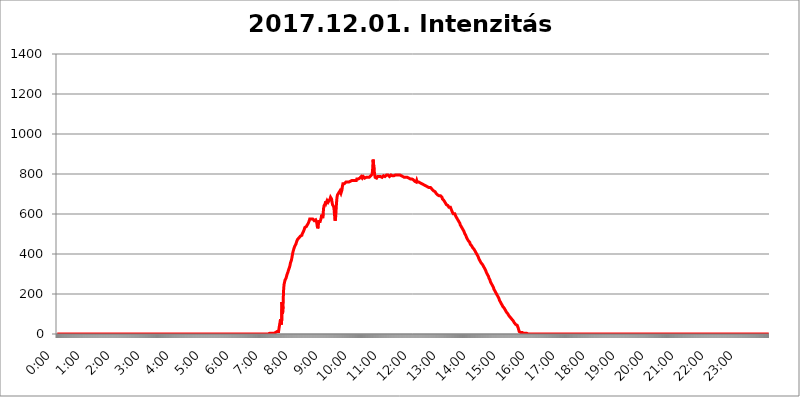
| Category | 2017.12.01. Intenzitás [W/m^2] |
|---|---|
| 0.0 | 0 |
| 0.0006944444444444445 | 0 |
| 0.001388888888888889 | 0 |
| 0.0020833333333333333 | 0 |
| 0.002777777777777778 | 0 |
| 0.003472222222222222 | 0 |
| 0.004166666666666667 | 0 |
| 0.004861111111111111 | 0 |
| 0.005555555555555556 | 0 |
| 0.0062499999999999995 | 0 |
| 0.006944444444444444 | 0 |
| 0.007638888888888889 | 0 |
| 0.008333333333333333 | 0 |
| 0.009027777777777779 | 0 |
| 0.009722222222222222 | 0 |
| 0.010416666666666666 | 0 |
| 0.011111111111111112 | 0 |
| 0.011805555555555555 | 0 |
| 0.012499999999999999 | 0 |
| 0.013194444444444444 | 0 |
| 0.013888888888888888 | 0 |
| 0.014583333333333332 | 0 |
| 0.015277777777777777 | 0 |
| 0.015972222222222224 | 0 |
| 0.016666666666666666 | 0 |
| 0.017361111111111112 | 0 |
| 0.018055555555555557 | 0 |
| 0.01875 | 0 |
| 0.019444444444444445 | 0 |
| 0.02013888888888889 | 0 |
| 0.020833333333333332 | 0 |
| 0.02152777777777778 | 0 |
| 0.022222222222222223 | 0 |
| 0.02291666666666667 | 0 |
| 0.02361111111111111 | 0 |
| 0.024305555555555556 | 0 |
| 0.024999999999999998 | 0 |
| 0.025694444444444447 | 0 |
| 0.02638888888888889 | 0 |
| 0.027083333333333334 | 0 |
| 0.027777777777777776 | 0 |
| 0.02847222222222222 | 0 |
| 0.029166666666666664 | 0 |
| 0.029861111111111113 | 0 |
| 0.030555555555555555 | 0 |
| 0.03125 | 0 |
| 0.03194444444444445 | 0 |
| 0.03263888888888889 | 0 |
| 0.03333333333333333 | 0 |
| 0.034027777777777775 | 0 |
| 0.034722222222222224 | 0 |
| 0.035416666666666666 | 0 |
| 0.036111111111111115 | 0 |
| 0.03680555555555556 | 0 |
| 0.0375 | 0 |
| 0.03819444444444444 | 0 |
| 0.03888888888888889 | 0 |
| 0.03958333333333333 | 0 |
| 0.04027777777777778 | 0 |
| 0.04097222222222222 | 0 |
| 0.041666666666666664 | 0 |
| 0.042361111111111106 | 0 |
| 0.04305555555555556 | 0 |
| 0.043750000000000004 | 0 |
| 0.044444444444444446 | 0 |
| 0.04513888888888889 | 0 |
| 0.04583333333333334 | 0 |
| 0.04652777777777778 | 0 |
| 0.04722222222222222 | 0 |
| 0.04791666666666666 | 0 |
| 0.04861111111111111 | 0 |
| 0.049305555555555554 | 0 |
| 0.049999999999999996 | 0 |
| 0.05069444444444445 | 0 |
| 0.051388888888888894 | 0 |
| 0.052083333333333336 | 0 |
| 0.05277777777777778 | 0 |
| 0.05347222222222222 | 0 |
| 0.05416666666666667 | 0 |
| 0.05486111111111111 | 0 |
| 0.05555555555555555 | 0 |
| 0.05625 | 0 |
| 0.05694444444444444 | 0 |
| 0.057638888888888885 | 0 |
| 0.05833333333333333 | 0 |
| 0.05902777777777778 | 0 |
| 0.059722222222222225 | 0 |
| 0.06041666666666667 | 0 |
| 0.061111111111111116 | 0 |
| 0.06180555555555556 | 0 |
| 0.0625 | 0 |
| 0.06319444444444444 | 0 |
| 0.06388888888888888 | 0 |
| 0.06458333333333334 | 0 |
| 0.06527777777777778 | 0 |
| 0.06597222222222222 | 0 |
| 0.06666666666666667 | 0 |
| 0.06736111111111111 | 0 |
| 0.06805555555555555 | 0 |
| 0.06874999999999999 | 0 |
| 0.06944444444444443 | 0 |
| 0.07013888888888889 | 0 |
| 0.07083333333333333 | 0 |
| 0.07152777777777779 | 0 |
| 0.07222222222222223 | 0 |
| 0.07291666666666667 | 0 |
| 0.07361111111111111 | 0 |
| 0.07430555555555556 | 0 |
| 0.075 | 0 |
| 0.07569444444444444 | 0 |
| 0.0763888888888889 | 0 |
| 0.07708333333333334 | 0 |
| 0.07777777777777778 | 0 |
| 0.07847222222222222 | 0 |
| 0.07916666666666666 | 0 |
| 0.0798611111111111 | 0 |
| 0.08055555555555556 | 0 |
| 0.08125 | 0 |
| 0.08194444444444444 | 0 |
| 0.08263888888888889 | 0 |
| 0.08333333333333333 | 0 |
| 0.08402777777777777 | 0 |
| 0.08472222222222221 | 0 |
| 0.08541666666666665 | 0 |
| 0.08611111111111112 | 0 |
| 0.08680555555555557 | 0 |
| 0.08750000000000001 | 0 |
| 0.08819444444444445 | 0 |
| 0.08888888888888889 | 0 |
| 0.08958333333333333 | 0 |
| 0.09027777777777778 | 0 |
| 0.09097222222222222 | 0 |
| 0.09166666666666667 | 0 |
| 0.09236111111111112 | 0 |
| 0.09305555555555556 | 0 |
| 0.09375 | 0 |
| 0.09444444444444444 | 0 |
| 0.09513888888888888 | 0 |
| 0.09583333333333333 | 0 |
| 0.09652777777777777 | 0 |
| 0.09722222222222222 | 0 |
| 0.09791666666666667 | 0 |
| 0.09861111111111111 | 0 |
| 0.09930555555555555 | 0 |
| 0.09999999999999999 | 0 |
| 0.10069444444444443 | 0 |
| 0.1013888888888889 | 0 |
| 0.10208333333333335 | 0 |
| 0.10277777777777779 | 0 |
| 0.10347222222222223 | 0 |
| 0.10416666666666667 | 0 |
| 0.10486111111111111 | 0 |
| 0.10555555555555556 | 0 |
| 0.10625 | 0 |
| 0.10694444444444444 | 0 |
| 0.1076388888888889 | 0 |
| 0.10833333333333334 | 0 |
| 0.10902777777777778 | 0 |
| 0.10972222222222222 | 0 |
| 0.1111111111111111 | 0 |
| 0.11180555555555556 | 0 |
| 0.11180555555555556 | 0 |
| 0.1125 | 0 |
| 0.11319444444444444 | 0 |
| 0.11388888888888889 | 0 |
| 0.11458333333333333 | 0 |
| 0.11527777777777777 | 0 |
| 0.11597222222222221 | 0 |
| 0.11666666666666665 | 0 |
| 0.1173611111111111 | 0 |
| 0.11805555555555557 | 0 |
| 0.11944444444444445 | 0 |
| 0.12013888888888889 | 0 |
| 0.12083333333333333 | 0 |
| 0.12152777777777778 | 0 |
| 0.12222222222222223 | 0 |
| 0.12291666666666667 | 0 |
| 0.12291666666666667 | 0 |
| 0.12361111111111112 | 0 |
| 0.12430555555555556 | 0 |
| 0.125 | 0 |
| 0.12569444444444444 | 0 |
| 0.12638888888888888 | 0 |
| 0.12708333333333333 | 0 |
| 0.16875 | 0 |
| 0.12847222222222224 | 0 |
| 0.12916666666666668 | 0 |
| 0.12986111111111112 | 0 |
| 0.13055555555555556 | 0 |
| 0.13125 | 0 |
| 0.13194444444444445 | 0 |
| 0.1326388888888889 | 0 |
| 0.13333333333333333 | 0 |
| 0.13402777777777777 | 0 |
| 0.13402777777777777 | 0 |
| 0.13472222222222222 | 0 |
| 0.13541666666666666 | 0 |
| 0.1361111111111111 | 0 |
| 0.13749999999999998 | 0 |
| 0.13819444444444443 | 0 |
| 0.1388888888888889 | 0 |
| 0.13958333333333334 | 0 |
| 0.14027777777777778 | 0 |
| 0.14097222222222222 | 0 |
| 0.14166666666666666 | 0 |
| 0.1423611111111111 | 0 |
| 0.14305555555555557 | 0 |
| 0.14375000000000002 | 0 |
| 0.14444444444444446 | 0 |
| 0.1451388888888889 | 0 |
| 0.1451388888888889 | 0 |
| 0.14652777777777778 | 0 |
| 0.14722222222222223 | 0 |
| 0.14791666666666667 | 0 |
| 0.1486111111111111 | 0 |
| 0.14930555555555555 | 0 |
| 0.15 | 0 |
| 0.15069444444444444 | 0 |
| 0.15138888888888888 | 0 |
| 0.15208333333333332 | 0 |
| 0.15277777777777776 | 0 |
| 0.15347222222222223 | 0 |
| 0.15416666666666667 | 0 |
| 0.15486111111111112 | 0 |
| 0.15555555555555556 | 0 |
| 0.15625 | 0 |
| 0.15694444444444444 | 0 |
| 0.15763888888888888 | 0 |
| 0.15833333333333333 | 0 |
| 0.15902777777777777 | 0 |
| 0.15972222222222224 | 0 |
| 0.16041666666666668 | 0 |
| 0.16111111111111112 | 0 |
| 0.16180555555555556 | 0 |
| 0.1625 | 0 |
| 0.16319444444444445 | 0 |
| 0.1638888888888889 | 0 |
| 0.16458333333333333 | 0 |
| 0.16527777777777777 | 0 |
| 0.16597222222222222 | 0 |
| 0.16666666666666666 | 0 |
| 0.1673611111111111 | 0 |
| 0.16805555555555554 | 0 |
| 0.16874999999999998 | 0 |
| 0.16944444444444443 | 0 |
| 0.17013888888888887 | 0 |
| 0.1708333333333333 | 0 |
| 0.17152777777777775 | 0 |
| 0.17222222222222225 | 0 |
| 0.1729166666666667 | 0 |
| 0.17361111111111113 | 0 |
| 0.17430555555555557 | 0 |
| 0.17500000000000002 | 0 |
| 0.17569444444444446 | 0 |
| 0.1763888888888889 | 0 |
| 0.17708333333333334 | 0 |
| 0.17777777777777778 | 0 |
| 0.17847222222222223 | 0 |
| 0.17916666666666667 | 0 |
| 0.1798611111111111 | 0 |
| 0.18055555555555555 | 0 |
| 0.18125 | 0 |
| 0.18194444444444444 | 0 |
| 0.1826388888888889 | 0 |
| 0.18333333333333335 | 0 |
| 0.1840277777777778 | 0 |
| 0.18472222222222223 | 0 |
| 0.18541666666666667 | 0 |
| 0.18611111111111112 | 0 |
| 0.18680555555555556 | 0 |
| 0.1875 | 0 |
| 0.18819444444444444 | 0 |
| 0.18888888888888888 | 0 |
| 0.18958333333333333 | 0 |
| 0.19027777777777777 | 0 |
| 0.1909722222222222 | 0 |
| 0.19166666666666665 | 0 |
| 0.19236111111111112 | 0 |
| 0.19305555555555554 | 0 |
| 0.19375 | 0 |
| 0.19444444444444445 | 0 |
| 0.1951388888888889 | 0 |
| 0.19583333333333333 | 0 |
| 0.19652777777777777 | 0 |
| 0.19722222222222222 | 0 |
| 0.19791666666666666 | 0 |
| 0.1986111111111111 | 0 |
| 0.19930555555555554 | 0 |
| 0.19999999999999998 | 0 |
| 0.20069444444444443 | 0 |
| 0.20138888888888887 | 0 |
| 0.2020833333333333 | 0 |
| 0.2027777777777778 | 0 |
| 0.2034722222222222 | 0 |
| 0.2041666666666667 | 0 |
| 0.20486111111111113 | 0 |
| 0.20555555555555557 | 0 |
| 0.20625000000000002 | 0 |
| 0.20694444444444446 | 0 |
| 0.2076388888888889 | 0 |
| 0.20833333333333334 | 0 |
| 0.20902777777777778 | 0 |
| 0.20972222222222223 | 0 |
| 0.21041666666666667 | 0 |
| 0.2111111111111111 | 0 |
| 0.21180555555555555 | 0 |
| 0.2125 | 0 |
| 0.21319444444444444 | 0 |
| 0.2138888888888889 | 0 |
| 0.21458333333333335 | 0 |
| 0.2152777777777778 | 0 |
| 0.21597222222222223 | 0 |
| 0.21666666666666667 | 0 |
| 0.21736111111111112 | 0 |
| 0.21805555555555556 | 0 |
| 0.21875 | 0 |
| 0.21944444444444444 | 0 |
| 0.22013888888888888 | 0 |
| 0.22083333333333333 | 0 |
| 0.22152777777777777 | 0 |
| 0.2222222222222222 | 0 |
| 0.22291666666666665 | 0 |
| 0.2236111111111111 | 0 |
| 0.22430555555555556 | 0 |
| 0.225 | 0 |
| 0.22569444444444445 | 0 |
| 0.2263888888888889 | 0 |
| 0.22708333333333333 | 0 |
| 0.22777777777777777 | 0 |
| 0.22847222222222222 | 0 |
| 0.22916666666666666 | 0 |
| 0.2298611111111111 | 0 |
| 0.23055555555555554 | 0 |
| 0.23124999999999998 | 0 |
| 0.23194444444444443 | 0 |
| 0.23263888888888887 | 0 |
| 0.2333333333333333 | 0 |
| 0.2340277777777778 | 0 |
| 0.2347222222222222 | 0 |
| 0.2354166666666667 | 0 |
| 0.23611111111111113 | 0 |
| 0.23680555555555557 | 0 |
| 0.23750000000000002 | 0 |
| 0.23819444444444446 | 0 |
| 0.2388888888888889 | 0 |
| 0.23958333333333334 | 0 |
| 0.24027777777777778 | 0 |
| 0.24097222222222223 | 0 |
| 0.24166666666666667 | 0 |
| 0.2423611111111111 | 0 |
| 0.24305555555555555 | 0 |
| 0.24375 | 0 |
| 0.24444444444444446 | 0 |
| 0.24513888888888888 | 0 |
| 0.24583333333333335 | 0 |
| 0.2465277777777778 | 0 |
| 0.24722222222222223 | 0 |
| 0.24791666666666667 | 0 |
| 0.24861111111111112 | 0 |
| 0.24930555555555556 | 0 |
| 0.25 | 0 |
| 0.25069444444444444 | 0 |
| 0.2513888888888889 | 0 |
| 0.2520833333333333 | 0 |
| 0.25277777777777777 | 0 |
| 0.2534722222222222 | 0 |
| 0.25416666666666665 | 0 |
| 0.2548611111111111 | 0 |
| 0.2555555555555556 | 0 |
| 0.25625000000000003 | 0 |
| 0.2569444444444445 | 0 |
| 0.2576388888888889 | 0 |
| 0.25833333333333336 | 0 |
| 0.2590277777777778 | 0 |
| 0.25972222222222224 | 0 |
| 0.2604166666666667 | 0 |
| 0.2611111111111111 | 0 |
| 0.26180555555555557 | 0 |
| 0.2625 | 0 |
| 0.26319444444444445 | 0 |
| 0.2638888888888889 | 0 |
| 0.26458333333333334 | 0 |
| 0.2652777777777778 | 0 |
| 0.2659722222222222 | 0 |
| 0.26666666666666666 | 0 |
| 0.2673611111111111 | 0 |
| 0.26805555555555555 | 0 |
| 0.26875 | 0 |
| 0.26944444444444443 | 0 |
| 0.2701388888888889 | 0 |
| 0.2708333333333333 | 0 |
| 0.27152777777777776 | 0 |
| 0.2722222222222222 | 0 |
| 0.27291666666666664 | 0 |
| 0.2736111111111111 | 0 |
| 0.2743055555555555 | 0 |
| 0.27499999999999997 | 0 |
| 0.27569444444444446 | 0 |
| 0.27638888888888885 | 0 |
| 0.27708333333333335 | 0 |
| 0.2777777777777778 | 0 |
| 0.27847222222222223 | 0 |
| 0.2791666666666667 | 0 |
| 0.2798611111111111 | 0 |
| 0.28055555555555556 | 0 |
| 0.28125 | 0 |
| 0.28194444444444444 | 0 |
| 0.2826388888888889 | 0 |
| 0.2833333333333333 | 0 |
| 0.28402777777777777 | 0 |
| 0.2847222222222222 | 0 |
| 0.28541666666666665 | 0 |
| 0.28611111111111115 | 0 |
| 0.28680555555555554 | 0 |
| 0.28750000000000003 | 0 |
| 0.2881944444444445 | 0 |
| 0.2888888888888889 | 0 |
| 0.28958333333333336 | 0 |
| 0.2902777777777778 | 0 |
| 0.29097222222222224 | 0 |
| 0.2916666666666667 | 0 |
| 0.2923611111111111 | 0 |
| 0.29305555555555557 | 0 |
| 0.29375 | 0 |
| 0.29444444444444445 | 0 |
| 0.2951388888888889 | 0 |
| 0.29583333333333334 | 0 |
| 0.2965277777777778 | 3.525 |
| 0.2972222222222222 | 3.525 |
| 0.29791666666666666 | 3.525 |
| 0.2986111111111111 | 3.525 |
| 0.29930555555555555 | 3.525 |
| 0.3 | 3.525 |
| 0.30069444444444443 | 3.525 |
| 0.3013888888888889 | 3.525 |
| 0.3020833333333333 | 3.525 |
| 0.30277777777777776 | 3.525 |
| 0.3034722222222222 | 3.525 |
| 0.30416666666666664 | 3.525 |
| 0.3048611111111111 | 7.887 |
| 0.3055555555555555 | 7.887 |
| 0.30624999999999997 | 7.887 |
| 0.3069444444444444 | 7.887 |
| 0.3076388888888889 | 12.257 |
| 0.30833333333333335 | 12.257 |
| 0.3090277777777778 | 12.257 |
| 0.30972222222222223 | 16.636 |
| 0.3104166666666667 | 12.257 |
| 0.3111111111111111 | 29.823 |
| 0.31180555555555556 | 29.823 |
| 0.3125 | 29.823 |
| 0.31319444444444444 | 74.246 |
| 0.3138888888888889 | 74.246 |
| 0.3145833333333333 | 47.511 |
| 0.31527777777777777 | 160.056 |
| 0.3159722222222222 | 101.184 |
| 0.31666666666666665 | 137.347 |
| 0.31736111111111115 | 214.746 |
| 0.31805555555555554 | 246.689 |
| 0.31875000000000003 | 251.251 |
| 0.3194444444444445 | 269.49 |
| 0.3201388888888889 | 269.49 |
| 0.32083333333333336 | 278.603 |
| 0.3215277777777778 | 283.156 |
| 0.32222222222222224 | 296.808 |
| 0.3229166666666667 | 301.354 |
| 0.3236111111111111 | 310.44 |
| 0.32430555555555557 | 319.517 |
| 0.325 | 324.052 |
| 0.32569444444444445 | 333.113 |
| 0.3263888888888889 | 342.162 |
| 0.32708333333333334 | 355.712 |
| 0.3277777777777778 | 360.221 |
| 0.3284722222222222 | 369.23 |
| 0.32916666666666666 | 382.715 |
| 0.3298611111111111 | 396.164 |
| 0.33055555555555555 | 409.574 |
| 0.33125 | 418.492 |
| 0.33194444444444443 | 427.39 |
| 0.3326388888888889 | 431.833 |
| 0.3333333333333333 | 440.702 |
| 0.3340277777777778 | 445.129 |
| 0.3347222222222222 | 449.551 |
| 0.3354166666666667 | 458.38 |
| 0.3361111111111111 | 462.786 |
| 0.3368055555555556 | 471.582 |
| 0.33749999999999997 | 471.582 |
| 0.33819444444444446 | 475.972 |
| 0.33888888888888885 | 480.356 |
| 0.33958333333333335 | 480.356 |
| 0.34027777777777773 | 480.356 |
| 0.34097222222222223 | 489.108 |
| 0.3416666666666666 | 489.108 |
| 0.3423611111111111 | 489.108 |
| 0.3430555555555555 | 493.475 |
| 0.34375 | 502.192 |
| 0.3444444444444445 | 506.542 |
| 0.3451388888888889 | 510.885 |
| 0.3458333333333334 | 515.223 |
| 0.34652777777777777 | 523.88 |
| 0.34722222222222227 | 532.513 |
| 0.34791666666666665 | 532.513 |
| 0.34861111111111115 | 536.82 |
| 0.34930555555555554 | 536.82 |
| 0.35000000000000003 | 541.121 |
| 0.3506944444444444 | 545.416 |
| 0.3513888888888889 | 549.704 |
| 0.3520833333333333 | 553.986 |
| 0.3527777777777778 | 558.261 |
| 0.3534722222222222 | 566.793 |
| 0.3541666666666667 | 575.299 |
| 0.3548611111111111 | 571.049 |
| 0.35555555555555557 | 575.299 |
| 0.35625 | 575.299 |
| 0.35694444444444445 | 571.049 |
| 0.3576388888888889 | 571.049 |
| 0.35833333333333334 | 575.299 |
| 0.3590277777777778 | 571.049 |
| 0.3597222222222222 | 575.299 |
| 0.36041666666666666 | 566.793 |
| 0.3611111111111111 | 562.53 |
| 0.36180555555555555 | 566.793 |
| 0.3625 | 571.049 |
| 0.36319444444444443 | 571.049 |
| 0.3638888888888889 | 558.261 |
| 0.3645833333333333 | 541.121 |
| 0.3652777777777778 | 528.2 |
| 0.3659722222222222 | 536.82 |
| 0.3666666666666667 | 562.53 |
| 0.3673611111111111 | 566.793 |
| 0.3680555555555556 | 566.793 |
| 0.36874999999999997 | 562.53 |
| 0.36944444444444446 | 558.261 |
| 0.37013888888888885 | 579.542 |
| 0.37083333333333335 | 596.45 |
| 0.37152777777777773 | 592.233 |
| 0.37222222222222223 | 579.542 |
| 0.3729166666666666 | 600.661 |
| 0.3736111111111111 | 629.948 |
| 0.3743055555555555 | 642.4 |
| 0.375 | 642.4 |
| 0.3756944444444445 | 650.667 |
| 0.3763888888888889 | 663.019 |
| 0.3770833333333334 | 654.791 |
| 0.37777777777777777 | 658.909 |
| 0.37847222222222227 | 667.123 |
| 0.37916666666666665 | 667.123 |
| 0.37986111111111115 | 658.909 |
| 0.38055555555555554 | 654.791 |
| 0.38125000000000003 | 667.123 |
| 0.3819444444444444 | 671.22 |
| 0.3826388888888889 | 675.311 |
| 0.3833333333333333 | 683.473 |
| 0.3840277777777778 | 683.473 |
| 0.3847222222222222 | 675.311 |
| 0.3854166666666667 | 658.909 |
| 0.3861111111111111 | 646.537 |
| 0.38680555555555557 | 646.537 |
| 0.3875 | 638.256 |
| 0.38819444444444445 | 625.784 |
| 0.3888888888888889 | 596.45 |
| 0.38958333333333334 | 566.793 |
| 0.3902777777777778 | 575.299 |
| 0.3909722222222222 | 613.252 |
| 0.39166666666666666 | 654.791 |
| 0.3923611111111111 | 683.473 |
| 0.39305555555555555 | 695.666 |
| 0.39375 | 699.717 |
| 0.39444444444444443 | 703.762 |
| 0.3951388888888889 | 707.8 |
| 0.3958333333333333 | 707.8 |
| 0.3965277777777778 | 715.858 |
| 0.3972222222222222 | 715.858 |
| 0.3979166666666667 | 703.762 |
| 0.3986111111111111 | 699.717 |
| 0.3993055555555556 | 719.877 |
| 0.39999999999999997 | 739.877 |
| 0.40069444444444446 | 751.803 |
| 0.40138888888888885 | 751.803 |
| 0.40208333333333335 | 751.803 |
| 0.40277777777777773 | 751.803 |
| 0.40347222222222223 | 751.803 |
| 0.4041666666666666 | 755.766 |
| 0.4048611111111111 | 759.723 |
| 0.4055555555555555 | 759.723 |
| 0.40625 | 759.723 |
| 0.4069444444444445 | 759.723 |
| 0.4076388888888889 | 759.723 |
| 0.4083333333333334 | 763.674 |
| 0.40902777777777777 | 759.723 |
| 0.40972222222222227 | 759.723 |
| 0.41041666666666665 | 763.674 |
| 0.41111111111111115 | 763.674 |
| 0.41180555555555554 | 767.62 |
| 0.41250000000000003 | 767.62 |
| 0.4131944444444444 | 767.62 |
| 0.4138888888888889 | 767.62 |
| 0.4145833333333333 | 771.559 |
| 0.4152777777777778 | 767.62 |
| 0.4159722222222222 | 771.559 |
| 0.4166666666666667 | 767.62 |
| 0.4173611111111111 | 767.62 |
| 0.41805555555555557 | 763.674 |
| 0.41875 | 767.62 |
| 0.41944444444444445 | 767.62 |
| 0.4201388888888889 | 775.492 |
| 0.42083333333333334 | 775.492 |
| 0.4215277777777778 | 775.492 |
| 0.4222222222222222 | 775.492 |
| 0.42291666666666666 | 775.492 |
| 0.4236111111111111 | 779.42 |
| 0.42430555555555555 | 779.42 |
| 0.425 | 779.42 |
| 0.42569444444444443 | 779.42 |
| 0.4263888888888889 | 787.258 |
| 0.4270833333333333 | 783.342 |
| 0.4277777777777778 | 779.42 |
| 0.4284722222222222 | 783.342 |
| 0.4291666666666667 | 787.258 |
| 0.4298611111111111 | 783.342 |
| 0.4305555555555556 | 783.342 |
| 0.43124999999999997 | 779.42 |
| 0.43194444444444446 | 779.42 |
| 0.43263888888888885 | 779.42 |
| 0.43333333333333335 | 783.342 |
| 0.43402777777777773 | 787.258 |
| 0.43472222222222223 | 783.342 |
| 0.4354166666666666 | 783.342 |
| 0.4361111111111111 | 783.342 |
| 0.4368055555555555 | 783.342 |
| 0.4375 | 783.342 |
| 0.4381944444444445 | 787.258 |
| 0.4388888888888889 | 787.258 |
| 0.4395833333333334 | 791.169 |
| 0.44027777777777777 | 787.258 |
| 0.44097222222222227 | 791.169 |
| 0.44166666666666665 | 798.974 |
| 0.44236111111111115 | 826.123 |
| 0.44305555555555554 | 872.114 |
| 0.44375000000000003 | 872.114 |
| 0.4444444444444444 | 818.392 |
| 0.4451388888888889 | 798.974 |
| 0.4458333333333333 | 783.342 |
| 0.4465277777777778 | 783.342 |
| 0.4472222222222222 | 783.342 |
| 0.4479166666666667 | 779.42 |
| 0.4486111111111111 | 783.342 |
| 0.44930555555555557 | 787.258 |
| 0.45 | 783.342 |
| 0.45069444444444445 | 787.258 |
| 0.4513888888888889 | 787.258 |
| 0.45208333333333334 | 791.169 |
| 0.4527777777777778 | 787.258 |
| 0.4534722222222222 | 787.258 |
| 0.45416666666666666 | 787.258 |
| 0.4548611111111111 | 787.258 |
| 0.45555555555555555 | 783.342 |
| 0.45625 | 783.342 |
| 0.45694444444444443 | 787.258 |
| 0.4576388888888889 | 791.169 |
| 0.4583333333333333 | 791.169 |
| 0.4590277777777778 | 787.258 |
| 0.4597222222222222 | 787.258 |
| 0.4604166666666667 | 787.258 |
| 0.4611111111111111 | 791.169 |
| 0.4618055555555556 | 795.074 |
| 0.46249999999999997 | 791.169 |
| 0.46319444444444446 | 791.169 |
| 0.46388888888888885 | 795.074 |
| 0.46458333333333335 | 795.074 |
| 0.46527777777777773 | 791.169 |
| 0.46597222222222223 | 787.258 |
| 0.4666666666666666 | 791.169 |
| 0.4673611111111111 | 791.169 |
| 0.4680555555555555 | 795.074 |
| 0.46875 | 795.074 |
| 0.4694444444444445 | 798.974 |
| 0.4701388888888889 | 791.169 |
| 0.4708333333333334 | 791.169 |
| 0.47152777777777777 | 791.169 |
| 0.47222222222222227 | 791.169 |
| 0.47291666666666665 | 791.169 |
| 0.47361111111111115 | 795.074 |
| 0.47430555555555554 | 795.074 |
| 0.47500000000000003 | 795.074 |
| 0.4756944444444444 | 795.074 |
| 0.4763888888888889 | 795.074 |
| 0.4770833333333333 | 795.074 |
| 0.4777777777777778 | 791.169 |
| 0.4784722222222222 | 795.074 |
| 0.4791666666666667 | 791.169 |
| 0.4798611111111111 | 795.074 |
| 0.48055555555555557 | 795.074 |
| 0.48125 | 795.074 |
| 0.48194444444444445 | 791.169 |
| 0.4826388888888889 | 791.169 |
| 0.48333333333333334 | 791.169 |
| 0.4840277777777778 | 791.169 |
| 0.4847222222222222 | 787.258 |
| 0.48541666666666666 | 787.258 |
| 0.4861111111111111 | 787.258 |
| 0.48680555555555555 | 783.342 |
| 0.4875 | 779.42 |
| 0.48819444444444443 | 787.258 |
| 0.4888888888888889 | 783.342 |
| 0.4895833333333333 | 787.258 |
| 0.4902777777777778 | 787.258 |
| 0.4909722222222222 | 783.342 |
| 0.4916666666666667 | 783.342 |
| 0.4923611111111111 | 779.42 |
| 0.4930555555555556 | 779.42 |
| 0.49374999999999997 | 779.42 |
| 0.49444444444444446 | 779.42 |
| 0.49513888888888885 | 775.492 |
| 0.49583333333333335 | 775.492 |
| 0.49652777777777773 | 771.559 |
| 0.49722222222222223 | 775.492 |
| 0.4979166666666666 | 775.492 |
| 0.4986111111111111 | 771.559 |
| 0.4993055555555555 | 771.559 |
| 0.5 | 767.62 |
| 0.5006944444444444 | 767.62 |
| 0.5013888888888889 | 763.674 |
| 0.5020833333333333 | 767.62 |
| 0.5027777777777778 | 767.62 |
| 0.5034722222222222 | 759.723 |
| 0.5041666666666667 | 767.62 |
| 0.5048611111111111 | 759.723 |
| 0.5055555555555555 | 759.723 |
| 0.50625 | 763.674 |
| 0.5069444444444444 | 759.723 |
| 0.5076388888888889 | 763.674 |
| 0.5083333333333333 | 759.723 |
| 0.5090277777777777 | 755.766 |
| 0.5097222222222222 | 751.803 |
| 0.5104166666666666 | 751.803 |
| 0.5111111111111112 | 751.803 |
| 0.5118055555555555 | 751.803 |
| 0.5125000000000001 | 751.803 |
| 0.5131944444444444 | 747.834 |
| 0.513888888888889 | 747.834 |
| 0.5145833333333333 | 743.859 |
| 0.5152777777777778 | 743.859 |
| 0.5159722222222222 | 747.834 |
| 0.5166666666666667 | 743.859 |
| 0.517361111111111 | 739.877 |
| 0.5180555555555556 | 735.89 |
| 0.5187499999999999 | 739.877 |
| 0.5194444444444445 | 735.89 |
| 0.5201388888888888 | 739.877 |
| 0.5208333333333334 | 735.89 |
| 0.5215277777777778 | 731.896 |
| 0.5222222222222223 | 727.896 |
| 0.5229166666666667 | 731.896 |
| 0.5236111111111111 | 731.896 |
| 0.5243055555555556 | 727.896 |
| 0.525 | 727.896 |
| 0.5256944444444445 | 723.889 |
| 0.5263888888888889 | 719.877 |
| 0.5270833333333333 | 719.877 |
| 0.5277777777777778 | 715.858 |
| 0.5284722222222222 | 711.832 |
| 0.5291666666666667 | 711.832 |
| 0.5298611111111111 | 711.832 |
| 0.5305555555555556 | 707.8 |
| 0.53125 | 703.762 |
| 0.5319444444444444 | 703.762 |
| 0.5326388888888889 | 699.717 |
| 0.5333333333333333 | 695.666 |
| 0.5340277777777778 | 695.666 |
| 0.5347222222222222 | 691.608 |
| 0.5354166666666667 | 691.608 |
| 0.5361111111111111 | 695.666 |
| 0.5368055555555555 | 691.608 |
| 0.5375 | 691.608 |
| 0.5381944444444444 | 687.544 |
| 0.5388888888888889 | 687.544 |
| 0.5395833333333333 | 683.473 |
| 0.5402777777777777 | 675.311 |
| 0.5409722222222222 | 675.311 |
| 0.5416666666666666 | 671.22 |
| 0.5423611111111112 | 667.123 |
| 0.5430555555555555 | 667.123 |
| 0.5437500000000001 | 663.019 |
| 0.5444444444444444 | 654.791 |
| 0.545138888888889 | 650.667 |
| 0.5458333333333333 | 646.537 |
| 0.5465277777777778 | 642.4 |
| 0.5472222222222222 | 646.537 |
| 0.5479166666666667 | 642.4 |
| 0.548611111111111 | 638.256 |
| 0.5493055555555556 | 634.105 |
| 0.5499999999999999 | 634.105 |
| 0.5506944444444445 | 634.105 |
| 0.5513888888888888 | 634.105 |
| 0.5520833333333334 | 629.948 |
| 0.5527777777777778 | 621.613 |
| 0.5534722222222223 | 621.613 |
| 0.5541666666666667 | 609.062 |
| 0.5548611111111111 | 604.864 |
| 0.5555555555555556 | 600.661 |
| 0.55625 | 596.45 |
| 0.5569444444444445 | 596.45 |
| 0.5576388888888889 | 600.661 |
| 0.5583333333333333 | 596.45 |
| 0.5590277777777778 | 588.009 |
| 0.5597222222222222 | 583.779 |
| 0.5604166666666667 | 583.779 |
| 0.5611111111111111 | 575.299 |
| 0.5618055555555556 | 571.049 |
| 0.5625 | 571.049 |
| 0.5631944444444444 | 562.53 |
| 0.5638888888888889 | 558.261 |
| 0.5645833333333333 | 553.986 |
| 0.5652777777777778 | 545.416 |
| 0.5659722222222222 | 541.121 |
| 0.5666666666666667 | 536.82 |
| 0.5673611111111111 | 532.513 |
| 0.5680555555555555 | 532.513 |
| 0.56875 | 523.88 |
| 0.5694444444444444 | 519.555 |
| 0.5701388888888889 | 515.223 |
| 0.5708333333333333 | 510.885 |
| 0.5715277777777777 | 502.192 |
| 0.5722222222222222 | 497.836 |
| 0.5729166666666666 | 493.475 |
| 0.5736111111111112 | 489.108 |
| 0.5743055555555555 | 480.356 |
| 0.5750000000000001 | 475.972 |
| 0.5756944444444444 | 475.972 |
| 0.576388888888889 | 467.187 |
| 0.5770833333333333 | 462.786 |
| 0.5777777777777778 | 462.786 |
| 0.5784722222222222 | 458.38 |
| 0.5791666666666667 | 449.551 |
| 0.579861111111111 | 449.551 |
| 0.5805555555555556 | 445.129 |
| 0.5812499999999999 | 440.702 |
| 0.5819444444444445 | 436.27 |
| 0.5826388888888888 | 431.833 |
| 0.5833333333333334 | 427.39 |
| 0.5840277777777778 | 427.39 |
| 0.5847222222222223 | 422.943 |
| 0.5854166666666667 | 418.492 |
| 0.5861111111111111 | 414.035 |
| 0.5868055555555556 | 409.574 |
| 0.5875 | 405.108 |
| 0.5881944444444445 | 405.108 |
| 0.5888888888888889 | 396.164 |
| 0.5895833333333333 | 391.685 |
| 0.5902777777777778 | 387.202 |
| 0.5909722222222222 | 382.715 |
| 0.5916666666666667 | 373.729 |
| 0.5923611111111111 | 369.23 |
| 0.5930555555555556 | 364.728 |
| 0.59375 | 360.221 |
| 0.5944444444444444 | 355.712 |
| 0.5951388888888889 | 351.198 |
| 0.5958333333333333 | 351.198 |
| 0.5965277777777778 | 346.682 |
| 0.5972222222222222 | 342.162 |
| 0.5979166666666667 | 337.639 |
| 0.5986111111111111 | 333.113 |
| 0.5993055555555555 | 328.584 |
| 0.6 | 324.052 |
| 0.6006944444444444 | 319.517 |
| 0.6013888888888889 | 314.98 |
| 0.6020833333333333 | 305.898 |
| 0.6027777777777777 | 301.354 |
| 0.6034722222222222 | 296.808 |
| 0.6041666666666666 | 292.259 |
| 0.6048611111111112 | 287.709 |
| 0.6055555555555555 | 278.603 |
| 0.6062500000000001 | 274.047 |
| 0.6069444444444444 | 269.49 |
| 0.607638888888889 | 260.373 |
| 0.6083333333333333 | 260.373 |
| 0.6090277777777778 | 251.251 |
| 0.6097222222222222 | 251.251 |
| 0.6104166666666667 | 242.127 |
| 0.611111111111111 | 237.564 |
| 0.6118055555555556 | 233 |
| 0.6124999999999999 | 223.873 |
| 0.6131944444444445 | 219.309 |
| 0.6138888888888888 | 214.746 |
| 0.6145833333333334 | 210.182 |
| 0.6152777777777778 | 205.62 |
| 0.6159722222222223 | 201.058 |
| 0.6166666666666667 | 196.497 |
| 0.6173611111111111 | 191.937 |
| 0.6180555555555556 | 187.378 |
| 0.61875 | 182.82 |
| 0.6194444444444445 | 178.264 |
| 0.6201388888888889 | 169.156 |
| 0.6208333333333333 | 164.605 |
| 0.6215277777777778 | 160.056 |
| 0.6222222222222222 | 155.509 |
| 0.6229166666666667 | 155.509 |
| 0.6236111111111111 | 146.423 |
| 0.6243055555555556 | 146.423 |
| 0.625 | 137.347 |
| 0.6256944444444444 | 137.347 |
| 0.6263888888888889 | 132.814 |
| 0.6270833333333333 | 128.284 |
| 0.6277777777777778 | 123.758 |
| 0.6284722222222222 | 119.235 |
| 0.6291666666666667 | 114.716 |
| 0.6298611111111111 | 110.201 |
| 0.6305555555555555 | 110.201 |
| 0.63125 | 105.69 |
| 0.6319444444444444 | 101.184 |
| 0.6326388888888889 | 96.682 |
| 0.6333333333333333 | 92.184 |
| 0.6340277777777777 | 92.184 |
| 0.6347222222222222 | 87.692 |
| 0.6354166666666666 | 83.205 |
| 0.6361111111111112 | 83.205 |
| 0.6368055555555555 | 78.722 |
| 0.6375000000000001 | 74.246 |
| 0.6381944444444444 | 74.246 |
| 0.638888888888889 | 69.775 |
| 0.6395833333333333 | 65.31 |
| 0.6402777777777778 | 60.85 |
| 0.6409722222222222 | 56.398 |
| 0.6416666666666667 | 56.398 |
| 0.642361111111111 | 51.951 |
| 0.6430555555555556 | 47.511 |
| 0.6437499999999999 | 47.511 |
| 0.6444444444444445 | 43.079 |
| 0.6451388888888888 | 43.079 |
| 0.6458333333333334 | 38.653 |
| 0.6465277777777778 | 29.823 |
| 0.6472222222222223 | 21.024 |
| 0.6479166666666667 | 12.257 |
| 0.6486111111111111 | 12.257 |
| 0.6493055555555556 | 12.257 |
| 0.65 | 7.887 |
| 0.6506944444444445 | 7.887 |
| 0.6513888888888889 | 7.887 |
| 0.6520833333333333 | 7.887 |
| 0.6527777777777778 | 7.887 |
| 0.6534722222222222 | 7.887 |
| 0.6541666666666667 | 3.525 |
| 0.6548611111111111 | 3.525 |
| 0.6555555555555556 | 3.525 |
| 0.65625 | 3.525 |
| 0.6569444444444444 | 3.525 |
| 0.6576388888888889 | 3.525 |
| 0.6583333333333333 | 3.525 |
| 0.6590277777777778 | 3.525 |
| 0.6597222222222222 | 0 |
| 0.6604166666666667 | 0 |
| 0.6611111111111111 | 0 |
| 0.6618055555555555 | 0 |
| 0.6625 | 0 |
| 0.6631944444444444 | 0 |
| 0.6638888888888889 | 0 |
| 0.6645833333333333 | 0 |
| 0.6652777777777777 | 0 |
| 0.6659722222222222 | 0 |
| 0.6666666666666666 | 0 |
| 0.6673611111111111 | 0 |
| 0.6680555555555556 | 0 |
| 0.6687500000000001 | 0 |
| 0.6694444444444444 | 0 |
| 0.6701388888888888 | 0 |
| 0.6708333333333334 | 0 |
| 0.6715277777777778 | 0 |
| 0.6722222222222222 | 0 |
| 0.6729166666666666 | 0 |
| 0.6736111111111112 | 0 |
| 0.6743055555555556 | 0 |
| 0.6749999999999999 | 0 |
| 0.6756944444444444 | 0 |
| 0.6763888888888889 | 0 |
| 0.6770833333333334 | 0 |
| 0.6777777777777777 | 0 |
| 0.6784722222222223 | 0 |
| 0.6791666666666667 | 0 |
| 0.6798611111111111 | 0 |
| 0.6805555555555555 | 0 |
| 0.68125 | 0 |
| 0.6819444444444445 | 0 |
| 0.6826388888888889 | 0 |
| 0.6833333333333332 | 0 |
| 0.6840277777777778 | 0 |
| 0.6847222222222222 | 0 |
| 0.6854166666666667 | 0 |
| 0.686111111111111 | 0 |
| 0.6868055555555556 | 0 |
| 0.6875 | 0 |
| 0.6881944444444444 | 0 |
| 0.688888888888889 | 0 |
| 0.6895833333333333 | 0 |
| 0.6902777777777778 | 0 |
| 0.6909722222222222 | 0 |
| 0.6916666666666668 | 0 |
| 0.6923611111111111 | 0 |
| 0.6930555555555555 | 0 |
| 0.69375 | 0 |
| 0.6944444444444445 | 0 |
| 0.6951388888888889 | 0 |
| 0.6958333333333333 | 0 |
| 0.6965277777777777 | 0 |
| 0.6972222222222223 | 0 |
| 0.6979166666666666 | 0 |
| 0.6986111111111111 | 0 |
| 0.6993055555555556 | 0 |
| 0.7000000000000001 | 0 |
| 0.7006944444444444 | 0 |
| 0.7013888888888888 | 0 |
| 0.7020833333333334 | 0 |
| 0.7027777777777778 | 0 |
| 0.7034722222222222 | 0 |
| 0.7041666666666666 | 0 |
| 0.7048611111111112 | 0 |
| 0.7055555555555556 | 0 |
| 0.7062499999999999 | 0 |
| 0.7069444444444444 | 0 |
| 0.7076388888888889 | 0 |
| 0.7083333333333334 | 0 |
| 0.7090277777777777 | 0 |
| 0.7097222222222223 | 0 |
| 0.7104166666666667 | 0 |
| 0.7111111111111111 | 0 |
| 0.7118055555555555 | 0 |
| 0.7125 | 0 |
| 0.7131944444444445 | 0 |
| 0.7138888888888889 | 0 |
| 0.7145833333333332 | 0 |
| 0.7152777777777778 | 0 |
| 0.7159722222222222 | 0 |
| 0.7166666666666667 | 0 |
| 0.717361111111111 | 0 |
| 0.7180555555555556 | 0 |
| 0.71875 | 0 |
| 0.7194444444444444 | 0 |
| 0.720138888888889 | 0 |
| 0.7208333333333333 | 0 |
| 0.7215277777777778 | 0 |
| 0.7222222222222222 | 0 |
| 0.7229166666666668 | 0 |
| 0.7236111111111111 | 0 |
| 0.7243055555555555 | 0 |
| 0.725 | 0 |
| 0.7256944444444445 | 0 |
| 0.7263888888888889 | 0 |
| 0.7270833333333333 | 0 |
| 0.7277777777777777 | 0 |
| 0.7284722222222223 | 0 |
| 0.7291666666666666 | 0 |
| 0.7298611111111111 | 0 |
| 0.7305555555555556 | 0 |
| 0.7312500000000001 | 0 |
| 0.7319444444444444 | 0 |
| 0.7326388888888888 | 0 |
| 0.7333333333333334 | 0 |
| 0.7340277777777778 | 0 |
| 0.7347222222222222 | 0 |
| 0.7354166666666666 | 0 |
| 0.7361111111111112 | 0 |
| 0.7368055555555556 | 0 |
| 0.7374999999999999 | 0 |
| 0.7381944444444444 | 0 |
| 0.7388888888888889 | 0 |
| 0.7395833333333334 | 0 |
| 0.7402777777777777 | 0 |
| 0.7409722222222223 | 0 |
| 0.7416666666666667 | 0 |
| 0.7423611111111111 | 0 |
| 0.7430555555555555 | 0 |
| 0.74375 | 0 |
| 0.7444444444444445 | 0 |
| 0.7451388888888889 | 0 |
| 0.7458333333333332 | 0 |
| 0.7465277777777778 | 0 |
| 0.7472222222222222 | 0 |
| 0.7479166666666667 | 0 |
| 0.748611111111111 | 0 |
| 0.7493055555555556 | 0 |
| 0.75 | 0 |
| 0.7506944444444444 | 0 |
| 0.751388888888889 | 0 |
| 0.7520833333333333 | 0 |
| 0.7527777777777778 | 0 |
| 0.7534722222222222 | 0 |
| 0.7541666666666668 | 0 |
| 0.7548611111111111 | 0 |
| 0.7555555555555555 | 0 |
| 0.75625 | 0 |
| 0.7569444444444445 | 0 |
| 0.7576388888888889 | 0 |
| 0.7583333333333333 | 0 |
| 0.7590277777777777 | 0 |
| 0.7597222222222223 | 0 |
| 0.7604166666666666 | 0 |
| 0.7611111111111111 | 0 |
| 0.7618055555555556 | 0 |
| 0.7625000000000001 | 0 |
| 0.7631944444444444 | 0 |
| 0.7638888888888888 | 0 |
| 0.7645833333333334 | 0 |
| 0.7652777777777778 | 0 |
| 0.7659722222222222 | 0 |
| 0.7666666666666666 | 0 |
| 0.7673611111111112 | 0 |
| 0.7680555555555556 | 0 |
| 0.7687499999999999 | 0 |
| 0.7694444444444444 | 0 |
| 0.7701388888888889 | 0 |
| 0.7708333333333334 | 0 |
| 0.7715277777777777 | 0 |
| 0.7722222222222223 | 0 |
| 0.7729166666666667 | 0 |
| 0.7736111111111111 | 0 |
| 0.7743055555555555 | 0 |
| 0.775 | 0 |
| 0.7756944444444445 | 0 |
| 0.7763888888888889 | 0 |
| 0.7770833333333332 | 0 |
| 0.7777777777777778 | 0 |
| 0.7784722222222222 | 0 |
| 0.7791666666666667 | 0 |
| 0.779861111111111 | 0 |
| 0.7805555555555556 | 0 |
| 0.78125 | 0 |
| 0.7819444444444444 | 0 |
| 0.782638888888889 | 0 |
| 0.7833333333333333 | 0 |
| 0.7840277777777778 | 0 |
| 0.7847222222222222 | 0 |
| 0.7854166666666668 | 0 |
| 0.7861111111111111 | 0 |
| 0.7868055555555555 | 0 |
| 0.7875 | 0 |
| 0.7881944444444445 | 0 |
| 0.7888888888888889 | 0 |
| 0.7895833333333333 | 0 |
| 0.7902777777777777 | 0 |
| 0.7909722222222223 | 0 |
| 0.7916666666666666 | 0 |
| 0.7923611111111111 | 0 |
| 0.7930555555555556 | 0 |
| 0.7937500000000001 | 0 |
| 0.7944444444444444 | 0 |
| 0.7951388888888888 | 0 |
| 0.7958333333333334 | 0 |
| 0.7965277777777778 | 0 |
| 0.7972222222222222 | 0 |
| 0.7979166666666666 | 0 |
| 0.7986111111111112 | 0 |
| 0.7993055555555556 | 0 |
| 0.7999999999999999 | 0 |
| 0.8006944444444444 | 0 |
| 0.8013888888888889 | 0 |
| 0.8020833333333334 | 0 |
| 0.8027777777777777 | 0 |
| 0.8034722222222223 | 0 |
| 0.8041666666666667 | 0 |
| 0.8048611111111111 | 0 |
| 0.8055555555555555 | 0 |
| 0.80625 | 0 |
| 0.8069444444444445 | 0 |
| 0.8076388888888889 | 0 |
| 0.8083333333333332 | 0 |
| 0.8090277777777778 | 0 |
| 0.8097222222222222 | 0 |
| 0.8104166666666667 | 0 |
| 0.811111111111111 | 0 |
| 0.8118055555555556 | 0 |
| 0.8125 | 0 |
| 0.8131944444444444 | 0 |
| 0.813888888888889 | 0 |
| 0.8145833333333333 | 0 |
| 0.8152777777777778 | 0 |
| 0.8159722222222222 | 0 |
| 0.8166666666666668 | 0 |
| 0.8173611111111111 | 0 |
| 0.8180555555555555 | 0 |
| 0.81875 | 0 |
| 0.8194444444444445 | 0 |
| 0.8201388888888889 | 0 |
| 0.8208333333333333 | 0 |
| 0.8215277777777777 | 0 |
| 0.8222222222222223 | 0 |
| 0.8229166666666666 | 0 |
| 0.8236111111111111 | 0 |
| 0.8243055555555556 | 0 |
| 0.8250000000000001 | 0 |
| 0.8256944444444444 | 0 |
| 0.8263888888888888 | 0 |
| 0.8270833333333334 | 0 |
| 0.8277777777777778 | 0 |
| 0.8284722222222222 | 0 |
| 0.8291666666666666 | 0 |
| 0.8298611111111112 | 0 |
| 0.8305555555555556 | 0 |
| 0.8312499999999999 | 0 |
| 0.8319444444444444 | 0 |
| 0.8326388888888889 | 0 |
| 0.8333333333333334 | 0 |
| 0.8340277777777777 | 0 |
| 0.8347222222222223 | 0 |
| 0.8354166666666667 | 0 |
| 0.8361111111111111 | 0 |
| 0.8368055555555555 | 0 |
| 0.8375 | 0 |
| 0.8381944444444445 | 0 |
| 0.8388888888888889 | 0 |
| 0.8395833333333332 | 0 |
| 0.8402777777777778 | 0 |
| 0.8409722222222222 | 0 |
| 0.8416666666666667 | 0 |
| 0.842361111111111 | 0 |
| 0.8430555555555556 | 0 |
| 0.84375 | 0 |
| 0.8444444444444444 | 0 |
| 0.845138888888889 | 0 |
| 0.8458333333333333 | 0 |
| 0.8465277777777778 | 0 |
| 0.8472222222222222 | 0 |
| 0.8479166666666668 | 0 |
| 0.8486111111111111 | 0 |
| 0.8493055555555555 | 0 |
| 0.85 | 0 |
| 0.8506944444444445 | 0 |
| 0.8513888888888889 | 0 |
| 0.8520833333333333 | 0 |
| 0.8527777777777777 | 0 |
| 0.8534722222222223 | 0 |
| 0.8541666666666666 | 0 |
| 0.8548611111111111 | 0 |
| 0.8555555555555556 | 0 |
| 0.8562500000000001 | 0 |
| 0.8569444444444444 | 0 |
| 0.8576388888888888 | 0 |
| 0.8583333333333334 | 0 |
| 0.8590277777777778 | 0 |
| 0.8597222222222222 | 0 |
| 0.8604166666666666 | 0 |
| 0.8611111111111112 | 0 |
| 0.8618055555555556 | 0 |
| 0.8624999999999999 | 0 |
| 0.8631944444444444 | 0 |
| 0.8638888888888889 | 0 |
| 0.8645833333333334 | 0 |
| 0.8652777777777777 | 0 |
| 0.8659722222222223 | 0 |
| 0.8666666666666667 | 0 |
| 0.8673611111111111 | 0 |
| 0.8680555555555555 | 0 |
| 0.86875 | 0 |
| 0.8694444444444445 | 0 |
| 0.8701388888888889 | 0 |
| 0.8708333333333332 | 0 |
| 0.8715277777777778 | 0 |
| 0.8722222222222222 | 0 |
| 0.8729166666666667 | 0 |
| 0.873611111111111 | 0 |
| 0.8743055555555556 | 0 |
| 0.875 | 0 |
| 0.8756944444444444 | 0 |
| 0.876388888888889 | 0 |
| 0.8770833333333333 | 0 |
| 0.8777777777777778 | 0 |
| 0.8784722222222222 | 0 |
| 0.8791666666666668 | 0 |
| 0.8798611111111111 | 0 |
| 0.8805555555555555 | 0 |
| 0.88125 | 0 |
| 0.8819444444444445 | 0 |
| 0.8826388888888889 | 0 |
| 0.8833333333333333 | 0 |
| 0.8840277777777777 | 0 |
| 0.8847222222222223 | 0 |
| 0.8854166666666666 | 0 |
| 0.8861111111111111 | 0 |
| 0.8868055555555556 | 0 |
| 0.8875000000000001 | 0 |
| 0.8881944444444444 | 0 |
| 0.8888888888888888 | 0 |
| 0.8895833333333334 | 0 |
| 0.8902777777777778 | 0 |
| 0.8909722222222222 | 0 |
| 0.8916666666666666 | 0 |
| 0.8923611111111112 | 0 |
| 0.8930555555555556 | 0 |
| 0.8937499999999999 | 0 |
| 0.8944444444444444 | 0 |
| 0.8951388888888889 | 0 |
| 0.8958333333333334 | 0 |
| 0.8965277777777777 | 0 |
| 0.8972222222222223 | 0 |
| 0.8979166666666667 | 0 |
| 0.8986111111111111 | 0 |
| 0.8993055555555555 | 0 |
| 0.9 | 0 |
| 0.9006944444444445 | 0 |
| 0.9013888888888889 | 0 |
| 0.9020833333333332 | 0 |
| 0.9027777777777778 | 0 |
| 0.9034722222222222 | 0 |
| 0.9041666666666667 | 0 |
| 0.904861111111111 | 0 |
| 0.9055555555555556 | 0 |
| 0.90625 | 0 |
| 0.9069444444444444 | 0 |
| 0.907638888888889 | 0 |
| 0.9083333333333333 | 0 |
| 0.9090277777777778 | 0 |
| 0.9097222222222222 | 0 |
| 0.9104166666666668 | 0 |
| 0.9111111111111111 | 0 |
| 0.9118055555555555 | 0 |
| 0.9125 | 0 |
| 0.9131944444444445 | 0 |
| 0.9138888888888889 | 0 |
| 0.9145833333333333 | 0 |
| 0.9152777777777777 | 0 |
| 0.9159722222222223 | 0 |
| 0.9166666666666666 | 0 |
| 0.9173611111111111 | 0 |
| 0.9180555555555556 | 0 |
| 0.9187500000000001 | 0 |
| 0.9194444444444444 | 0 |
| 0.9201388888888888 | 0 |
| 0.9208333333333334 | 0 |
| 0.9215277777777778 | 0 |
| 0.9222222222222222 | 0 |
| 0.9229166666666666 | 0 |
| 0.9236111111111112 | 0 |
| 0.9243055555555556 | 0 |
| 0.9249999999999999 | 0 |
| 0.9256944444444444 | 0 |
| 0.9263888888888889 | 0 |
| 0.9270833333333334 | 0 |
| 0.9277777777777777 | 0 |
| 0.9284722222222223 | 0 |
| 0.9291666666666667 | 0 |
| 0.9298611111111111 | 0 |
| 0.9305555555555555 | 0 |
| 0.93125 | 0 |
| 0.9319444444444445 | 0 |
| 0.9326388888888889 | 0 |
| 0.9333333333333332 | 0 |
| 0.9340277777777778 | 0 |
| 0.9347222222222222 | 0 |
| 0.9354166666666667 | 0 |
| 0.936111111111111 | 0 |
| 0.9368055555555556 | 0 |
| 0.9375 | 0 |
| 0.9381944444444444 | 0 |
| 0.938888888888889 | 0 |
| 0.9395833333333333 | 0 |
| 0.9402777777777778 | 0 |
| 0.9409722222222222 | 0 |
| 0.9416666666666668 | 0 |
| 0.9423611111111111 | 0 |
| 0.9430555555555555 | 0 |
| 0.94375 | 0 |
| 0.9444444444444445 | 0 |
| 0.9451388888888889 | 0 |
| 0.9458333333333333 | 0 |
| 0.9465277777777777 | 0 |
| 0.9472222222222223 | 0 |
| 0.9479166666666666 | 0 |
| 0.9486111111111111 | 0 |
| 0.9493055555555556 | 0 |
| 0.9500000000000001 | 0 |
| 0.9506944444444444 | 0 |
| 0.9513888888888888 | 0 |
| 0.9520833333333334 | 0 |
| 0.9527777777777778 | 0 |
| 0.9534722222222222 | 0 |
| 0.9541666666666666 | 0 |
| 0.9548611111111112 | 0 |
| 0.9555555555555556 | 0 |
| 0.9562499999999999 | 0 |
| 0.9569444444444444 | 0 |
| 0.9576388888888889 | 0 |
| 0.9583333333333334 | 0 |
| 0.9590277777777777 | 0 |
| 0.9597222222222223 | 0 |
| 0.9604166666666667 | 0 |
| 0.9611111111111111 | 0 |
| 0.9618055555555555 | 0 |
| 0.9625 | 0 |
| 0.9631944444444445 | 0 |
| 0.9638888888888889 | 0 |
| 0.9645833333333332 | 0 |
| 0.9652777777777778 | 0 |
| 0.9659722222222222 | 0 |
| 0.9666666666666667 | 0 |
| 0.967361111111111 | 0 |
| 0.9680555555555556 | 0 |
| 0.96875 | 0 |
| 0.9694444444444444 | 0 |
| 0.970138888888889 | 0 |
| 0.9708333333333333 | 0 |
| 0.9715277777777778 | 0 |
| 0.9722222222222222 | 0 |
| 0.9729166666666668 | 0 |
| 0.9736111111111111 | 0 |
| 0.9743055555555555 | 0 |
| 0.975 | 0 |
| 0.9756944444444445 | 0 |
| 0.9763888888888889 | 0 |
| 0.9770833333333333 | 0 |
| 0.9777777777777777 | 0 |
| 0.9784722222222223 | 0 |
| 0.9791666666666666 | 0 |
| 0.9798611111111111 | 0 |
| 0.9805555555555556 | 0 |
| 0.9812500000000001 | 0 |
| 0.9819444444444444 | 0 |
| 0.9826388888888888 | 0 |
| 0.9833333333333334 | 0 |
| 0.9840277777777778 | 0 |
| 0.9847222222222222 | 0 |
| 0.9854166666666666 | 0 |
| 0.9861111111111112 | 0 |
| 0.9868055555555556 | 0 |
| 0.9874999999999999 | 0 |
| 0.9881944444444444 | 0 |
| 0.9888888888888889 | 0 |
| 0.9895833333333334 | 0 |
| 0.9902777777777777 | 0 |
| 0.9909722222222223 | 0 |
| 0.9916666666666667 | 0 |
| 0.9923611111111111 | 0 |
| 0.9930555555555555 | 0 |
| 0.99375 | 0 |
| 0.9944444444444445 | 0 |
| 0.9951388888888889 | 0 |
| 0.9958333333333332 | 0 |
| 0.9965277777777778 | 0 |
| 0.9972222222222222 | 0 |
| 0.9979166666666667 | 0 |
| 0.998611111111111 | 0 |
| 0.9993055555555556 | 0 |